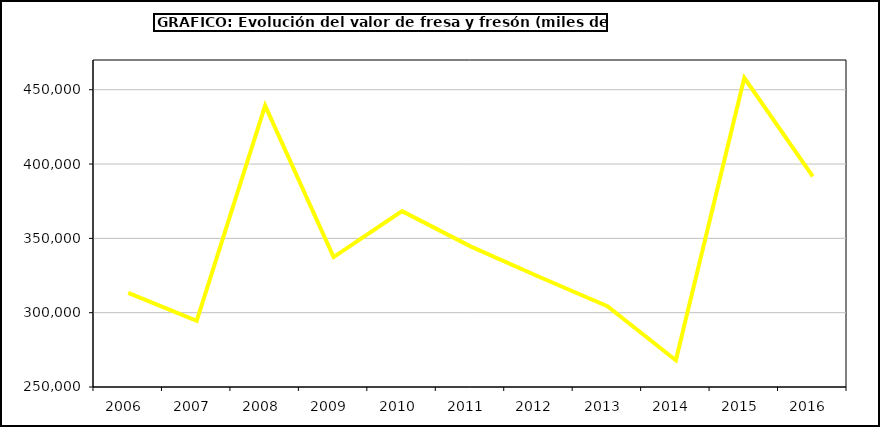
| Category | Valor |
|---|---|
| 2006.0 | 313299.78 |
| 2007.0 | 294464.98 |
| 2008.0 | 439353.128 |
| 2009.0 | 337386.548 |
| 2010.0 | 368287.313 |
| 2011.0 | 344604.077 |
| 2012.0 | 324144.524 |
| 2013.0 | 304404.377 |
| 2014.0 | 267944.247 |
| 2015.0 | 457982 |
| 2016.0 | 391643 |